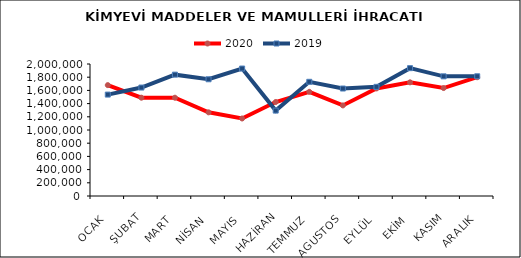
| Category | 2020 | 2019 |
|---|---|---|
| OCAK | 1680111.364 | 1536610.524 |
| ŞUBAT | 1489541.609 | 1643183.353 |
| MART | 1489130.474 | 1838591.79 |
| NİSAN | 1267629.913 | 1768584.323 |
| MAYIS | 1174502.027 | 1931271.841 |
| HAZİRAN | 1424066.946 | 1294015.559 |
| TEMMUZ | 1578369.062 | 1730130.658 |
| AGUSTOS | 1372417.455 | 1628382.443 |
| EYLÜL | 1629953.807 | 1653646.098 |
| EKİM | 1722246.954 | 1936801.166 |
| KASIM | 1635783.173 | 1813159.168 |
| ARALIK | 1799735.652 | 1813829.923 |